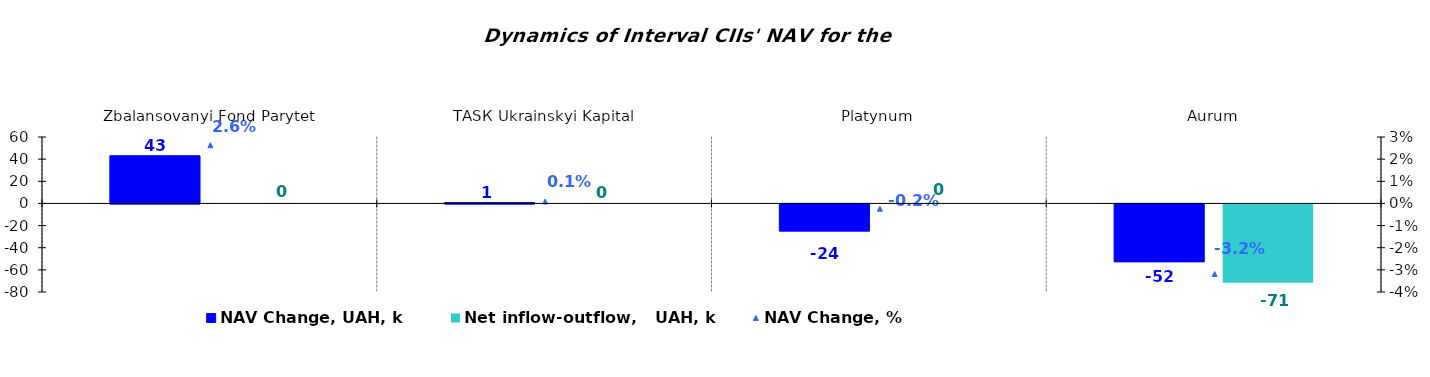
| Category | NAV Change, UAH, k | Net inflow-outflow,   UAH, k |
|---|---|---|
| Zbalansovanyi Fond Parytet | 43.076 | 0 |
| ТАSК Ukrainskyi Kapital | 0.733 | 0 |
| Platynum | -24.398 | 0 |
| Aurum | -52.132 | -70.672 |